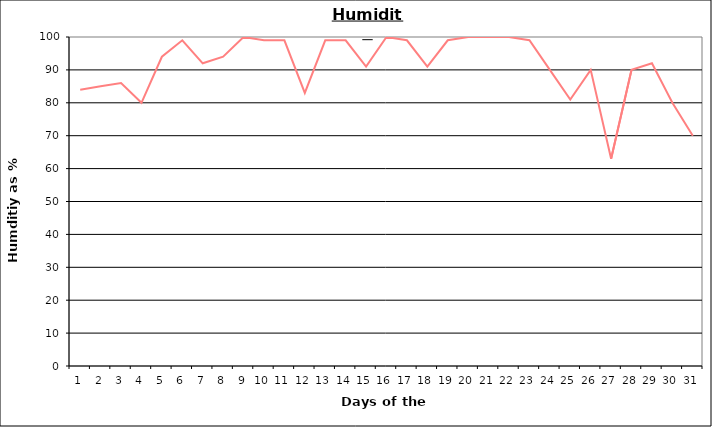
| Category | Series 0 |
|---|---|
| 0 | 84 |
| 1 | 85 |
| 2 | 86 |
| 3 | 80 |
| 4 | 94 |
| 5 | 99 |
| 6 | 92 |
| 7 | 94 |
| 8 | 100 |
| 9 | 99 |
| 10 | 99 |
| 11 | 83 |
| 12 | 99 |
| 13 | 99 |
| 14 | 91 |
| 15 | 100 |
| 16 | 99 |
| 17 | 91 |
| 18 | 99 |
| 19 | 100 |
| 20 | 100 |
| 21 | 100 |
| 22 | 99 |
| 23 | 90 |
| 24 | 81 |
| 25 | 90 |
| 26 | 63 |
| 27 | 90 |
| 28 | 92 |
| 29 | 80 |
| 30 | 70 |